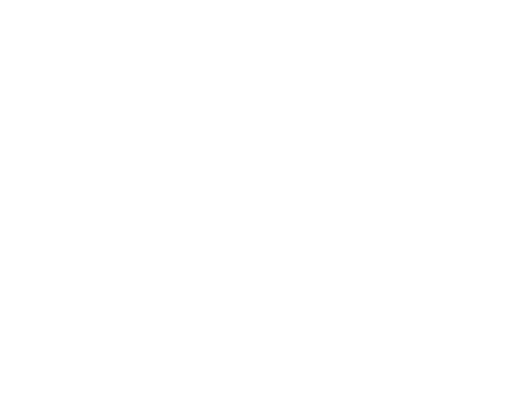
| Category | Series 0 | Series 1 | Series 2 |
|---|---|---|---|
| Impuestos | 10092104.89 | 0.137 |  |
| Cuotas y Aportaciones de Seguridad Social | 0 | 0 |  |
| Contribuciones de Mejoras | 1307.2 | 0 |  |
| Derechos | 3457654.66 | 0.047 |  |
| Productos | 418107.49 | 0.006 |  |
| Aprovechamientos | 1369101.07 | 0.019 |  |
| Ingresos por Ventas de Bienes y Servicios | 0 | 0 |  |
| Participaciones y Aportaciones | 58586042.61 | 0.793 |  |
| Transferencias, Asignaciones, Subsidios y Otras Ayudas | 0 | 0 |  |
| Ingresos Derivados de Financiamientos | 0 | 0 |  |